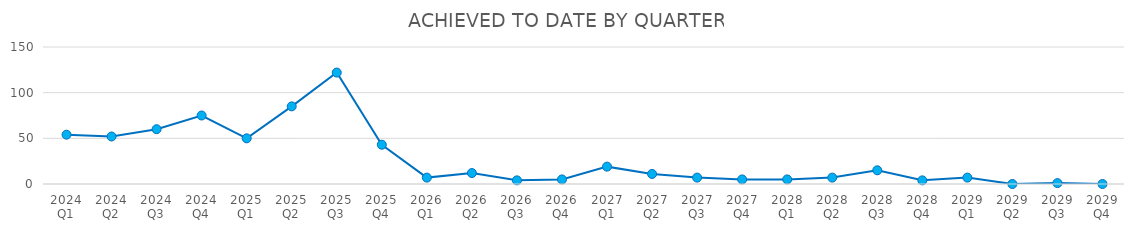
| Category | ACHIEVED TO DATE |
|---|---|
| 2024 Q1 | 54 |
| 2024 Q2 | 52 |
| 2024 Q3 | 60 |
| 2024 Q4 | 75 |
| 2025 Q1 | 50 |
| 2025 Q2 | 85 |
| 2025 Q3 | 122 |
| 2025 Q4 | 43 |
| 2026 Q1 | 7 |
| 2026 Q2 | 12 |
| 2026 Q3 | 4 |
| 2026 Q4 | 5 |
| 2027 Q1 | 19 |
| 2027 Q2 | 11 |
| 2027 Q3 | 7 |
| 2027 Q4 | 5 |
| 2028 Q1 | 5 |
| 2028 Q2 | 7 |
| 2028 Q3 | 15 |
| 2028 Q4 | 4 |
| 2029 Q1 | 7 |
| 2029 Q2 | 0 |
| 2029 Q3 | 1 |
| 2029 Q4 | 0 |